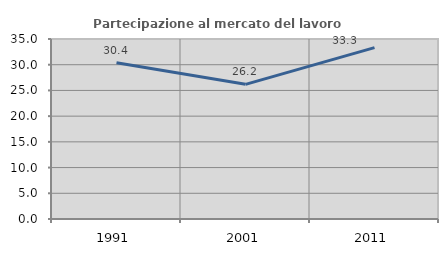
| Category | Partecipazione al mercato del lavoro  femminile |
|---|---|
| 1991.0 | 30.37 |
| 2001.0 | 26.182 |
| 2011.0 | 33.333 |